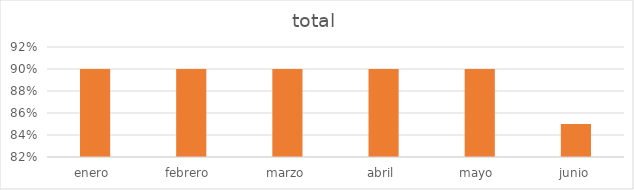
| Category | total |
|---|---|
| enero  | 0.9 |
| febrero  | 0.9 |
| marzo | 0.9 |
| abril  | 0.9 |
| mayo  | 0.9 |
| junio | 0.85 |